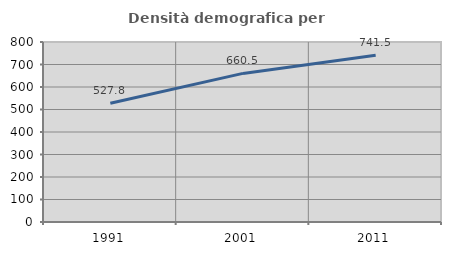
| Category | Densità demografica |
|---|---|
| 1991.0 | 527.816 |
| 2001.0 | 660.489 |
| 2011.0 | 741.482 |